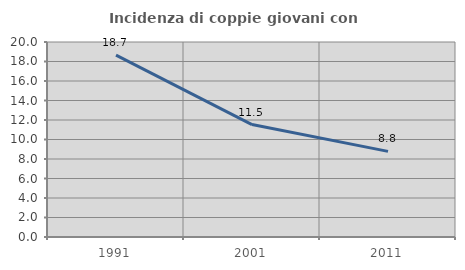
| Category | Incidenza di coppie giovani con figli |
|---|---|
| 1991.0 | 18.653 |
| 2001.0 | 11.529 |
| 2011.0 | 8.783 |